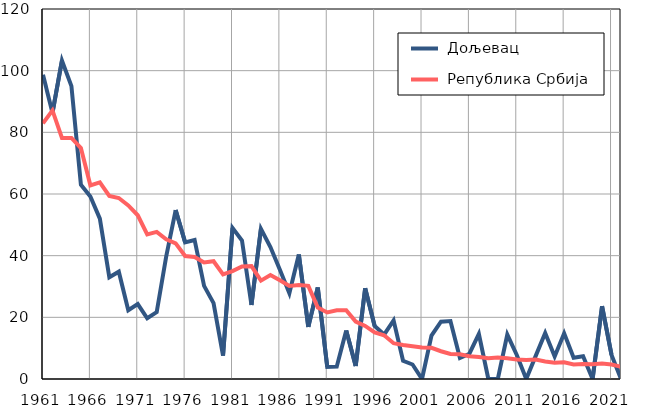
| Category |  Дољевац |  Република Србија |
|---|---|---|
| 1961.0 | 98.7 | 82.9 |
| 1962.0 | 86.3 | 87.1 |
| 1963.0 | 103.3 | 78.2 |
| 1964.0 | 95 | 78.2 |
| 1965.0 | 63 | 74.9 |
| 1966.0 | 59.2 | 62.8 |
| 1967.0 | 52 | 63.8 |
| 1968.0 | 33 | 59.4 |
| 1969.0 | 34.8 | 58.7 |
| 1970.0 | 22.3 | 56.3 |
| 1971.0 | 24.3 | 53.1 |
| 1972.0 | 19.7 | 46.9 |
| 1973.0 | 21.7 | 47.7 |
| 1974.0 | 39.7 | 45.3 |
| 1975.0 | 54.8 | 44 |
| 1976.0 | 44.3 | 39.9 |
| 1977.0 | 45.1 | 39.6 |
| 1978.0 | 30.2 | 37.8 |
| 1979.0 | 24.6 | 38.2 |
| 1980.0 | 7.6 | 33.9 |
| 1981.0 | 49 | 35 |
| 1982.0 | 44.9 | 36.5 |
| 1983.0 | 24 | 36.6 |
| 1984.0 | 48.7 | 31.9 |
| 1985.0 | 42.8 | 33.7 |
| 1986.0 | 35.4 | 32 |
| 1987.0 | 27.8 | 30.2 |
| 1988.0 | 40.4 | 30.5 |
| 1989.0 | 16.9 | 30.2 |
| 1990.0 | 29.7 | 23.2 |
| 1991.0 | 3.9 | 21.6 |
| 1992.0 | 4 | 22.3 |
| 1993.0 | 15.7 | 22.3 |
| 1994.0 | 4.2 | 18.6 |
| 1995.0 | 29.4 | 17.2 |
| 1996.0 | 17.2 | 15.1 |
| 1997.0 | 14.4 | 14.2 |
| 1998.0 | 19 | 11.6 |
| 1999.0 | 5.9 | 11 |
| 2000.0 | 4.7 | 10.6 |
| 2001.0 | 0 | 10.2 |
| 2002.0 | 14.1 | 10.1 |
| 2003.0 | 18.6 | 9 |
| 2004.0 | 18.8 | 8.1 |
| 2005.0 | 6.8 | 8 |
| 2006.0 | 8.2 | 7.4 |
| 2007.0 | 14.6 | 7.1 |
| 2008.0 | 0 | 6.7 |
| 2009.0 | 0 | 7 |
| 2010.0 | 14.4 | 6.7 |
| 2011.0 | 7.8 | 6.3 |
| 2012.0 | 0 | 6.2 |
| 2013.0 | 7.5 | 6.3 |
| 2014.0 | 14.9 | 5.7 |
| 2015.0 | 7.3 | 5.3 |
| 2016.0 | 14.8 | 5.4 |
| 2017.0 | 6.9 | 4.7 |
| 2018.0 | 7.4 | 4.9 |
| 2019.0 | 0 | 4.8 |
| 2020.0 | 23.6 | 5 |
| 2021.0 | 7.8 | 4.7 |
| 2022.0 | 0 | 4 |